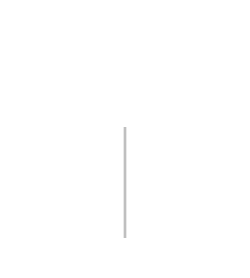
| Category | Positive | Negative |
|---|---|---|
| 0 | 0 | 0 |
| 1 | 2040 | 0 |
| 2 | 2040 | -2040 |